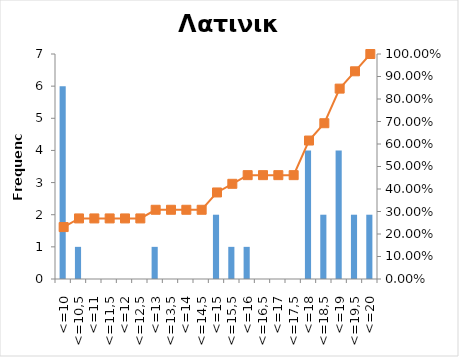
| Category | Series 0 |
|---|---|
| <=10 | 6 |
| <=10,5 | 1 |
| <=11 | 0 |
| <=11,5 | 0 |
| <=12 | 0 |
| <=12,5 | 0 |
| <=13 | 1 |
| <=13,5 | 0 |
| <=14 | 0 |
| <=14,5 | 0 |
| <=15 | 2 |
| <=15,5 | 1 |
| <=16 | 1 |
| <=16,5 | 0 |
| <=17 | 0 |
| <=17,5 | 0 |
| <=18 | 4 |
| <=18,5 | 2 |
| <=19 | 4 |
| <=19,5 | 2 |
| <=20 | 2 |